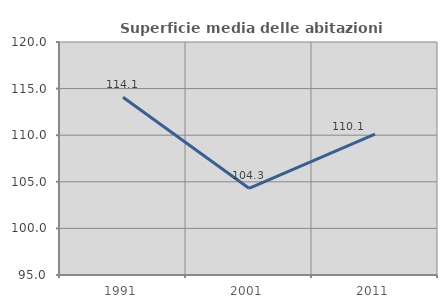
| Category | Superficie media delle abitazioni occupate |
|---|---|
| 1991.0 | 114.062 |
| 2001.0 | 104.305 |
| 2011.0 | 110.107 |